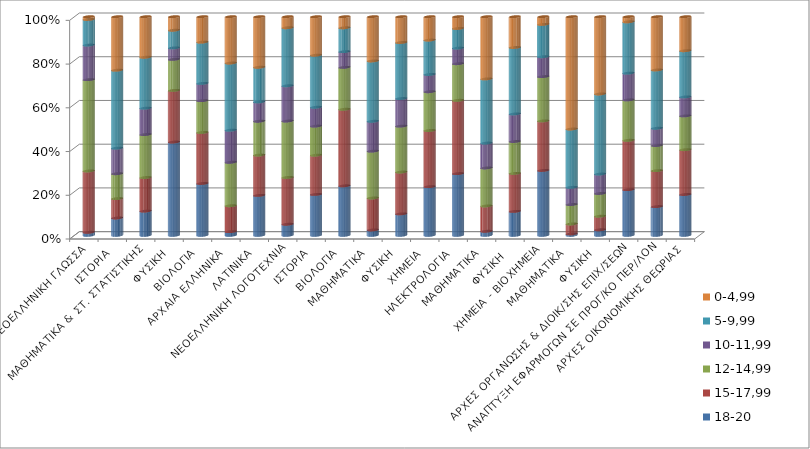
| Category | 18-20 | 15-17,99 | 12-14,99 | 10-11,99 | 5-9,99 | 0-4,99 |
|---|---|---|---|---|---|---|
| ΝΕΟΕΛΛΗΝΙΚΗ ΓΛΩΣΣΑ | 1.39 | 28.06 | 41.73 | 15.81 | 11.72 | 1.26 |
| ΙΣΤΟΡΙΑ | 7.94 | 8.87 | 11.37 | 11.68 | 35.66 | 24.45 |
| ΜΑΘΗΜΑΤΙΚΑ & ΣΤ. ΣΤΑΤΙΣΤΙΚΗΣ | 11.09 | 15.36 | 19.65 | 12.05 | 23.29 | 18.53 |
| ΦΥΣΙΚΗ | 42.66 | 23.6 | 14.19 | 5.25 | 8.07 | 6.19 |
| ΒΙΟΛΟΓΙΑ | 23.72 | 23.33 | 14.53 | 7.89 | 18.87 | 11.63 |
| ΑΡΧΑΙΑ ΕΛΛΗΝΙΚΑ  | 1.7 | 11.85 | 19.86 | 14.68 | 30.7 | 21.19 |
| ΛΑΤΙΝΙΚΑ | 18.27 | 18.42 | 15.48 | 8.83 | 15.85 | 23.12 |
| ΝΕΟΕΛΛΗΝΙΚΗ ΛΟΓΟΤΕΧΝΙΑ | 5.07 | 21.41 | 25.78 | 16.13 | 26.54 | 5.04 |
| ΙΣΤΟΡΙΑ | 18.71 | 17.94 | 13.3 | 8.61 | 23.81 | 17.6 |
| ΒΙΟΛΟΓΙΑ | 22.64 | 35.01 | 19.15 | 7.18 | 10.92 | 5.07 |
| ΜΑΘΗΜΑΤΙΚΑ | 2.47 | 14.61 | 21.42 | 13.65 | 27.59 | 20.23 |
| ΦΥΣΙΚΗ | 9.82 | 19.12 | 20.98 | 12.63 | 25.62 | 11.8 |
| ΧΗΜΕΙΑ | 22.26 | 25.68 | 17.72 | 7.89 | 15.73 | 10.69 |
| ΗΛΕΚΤΡΟΛΟΓΙΑ  | 28.23 | 33.5 | 16.75 | 7.13 | 8.99 | 5.37 |
| ΜΑΘΗΜΑΤΙΚΑ | 1.86 | 11.58 | 17.37 | 11.37 | 29.36 | 28.43 |
| ΦΥΣΙΚΗ  | 10.96 | 17.37 | 14.58 | 12.61 | 30.4 | 14.06 |
| ΧΗΜΕΙΑ - ΒΙΟΧΗΜΕΙΑ | 29.67 | 22.64 | 20.26 | 9.1 | 14.78 | 3.51 |
| ΜΑΘΗΜΑΤΙΚΑ | 0.65 | 4.55 | 8.88 | 7.86 | 26.68 | 51.35 |
| ΦΥΣΙΚΗ | 2.55 | 6.2 | 10.39 | 8.88 | 36.63 | 35.33 |
| ΑΡΧΕΣ ΟΡΓΑΝΩΣΗΣ & ΔΙΟΙΚ/ΣΗΣ ΕΠΙΧ/ΣΕΩΝ | 20.9 | 22.55 | 18.5 | 12.22 | 23.47 | 2.34 |
| ΑΝΑΠΤΥΞΗ ΕΦΑΡΜΟΓΩΝ ΣΕ ΠΡΟΓ/ΚΟ ΠΕΡ/ΛΟΝ | 13.14 | 16.44 | 11.48 | 7.9 | 26.67 | 24.34 |
| ΑΡΧΕΣ ΟΙΚΟΝΟΜΙΚΗΣ ΘΕΩΡΙΑΣ | 18.69 | 20.48 | 15.46 | 8.67 | 21.13 | 15.55 |